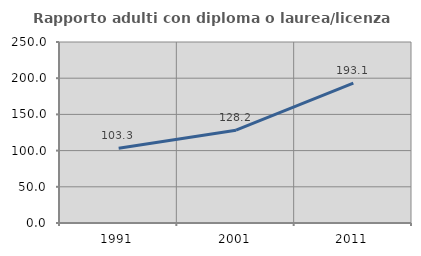
| Category | Rapporto adulti con diploma o laurea/licenza media  |
|---|---|
| 1991.0 | 103.33 |
| 2001.0 | 128.2 |
| 2011.0 | 193.117 |